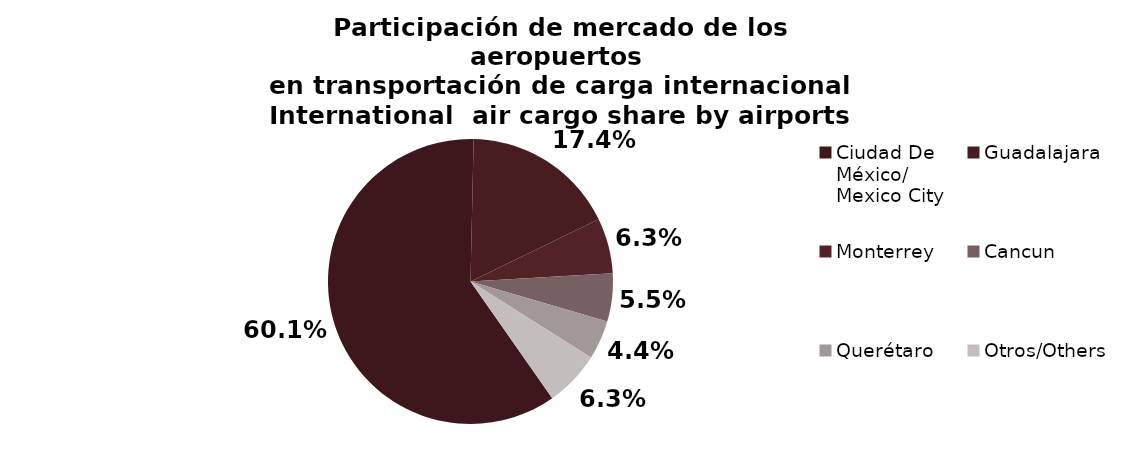
| Category | Series 0 |
|---|---|
| Ciudad De 
México/
Mexico City | 40229.262 |
| Guadalajara | 11683.758 |
| Monterrey | 4195.998 |
| Cancun | 3664.446 |
| Querétaro | 2959.071 |
| Otros/Others | 4232.398 |